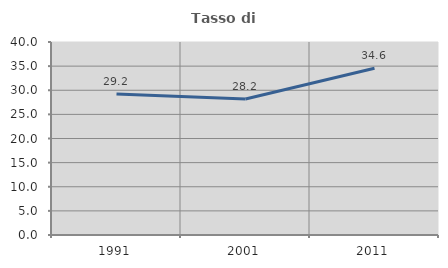
| Category | Tasso di occupazione   |
|---|---|
| 1991.0 | 29.21 |
| 2001.0 | 28.198 |
| 2011.0 | 34.573 |